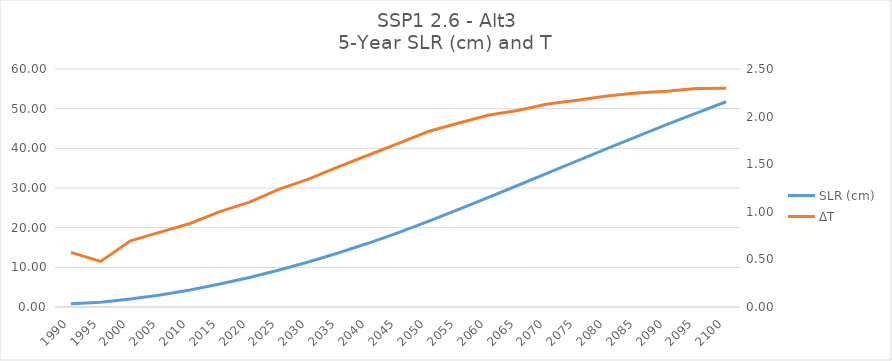
| Category | SLR (cm) |
|---|---|
| 1990.0 | 0.83 |
| 1995.0 | 1.225 |
| 2000.0 | 2.004 |
| 2005.0 | 3.047 |
| 2010.0 | 4.302 |
| 2015.0 | 5.786 |
| 2020.0 | 7.449 |
| 2025.0 | 9.339 |
| 2030.0 | 11.401 |
| 2035.0 | 13.667 |
| 2040.0 | 16.122 |
| 2045.0 | 18.765 |
| 2050.0 | 21.597 |
| 2055.0 | 24.539 |
| 2060.0 | 27.576 |
| 2065.0 | 30.631 |
| 2070.0 | 33.738 |
| 2075.0 | 36.83 |
| 2080.0 | 39.917 |
| 2085.0 | 42.969 |
| 2090.0 | 45.957 |
| 2095.0 | 48.899 |
| 2100.0 | 51.74 |